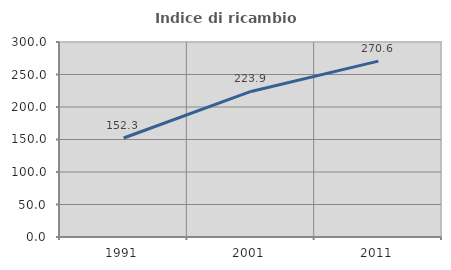
| Category | Indice di ricambio occupazionale  |
|---|---|
| 1991.0 | 152.333 |
| 2001.0 | 223.921 |
| 2011.0 | 270.632 |